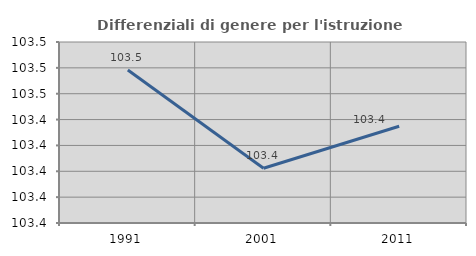
| Category | Differenziali di genere per l'istruzione superiore |
|---|---|
| 1991.0 | 103.478 |
| 2001.0 | 103.402 |
| 2011.0 | 103.435 |